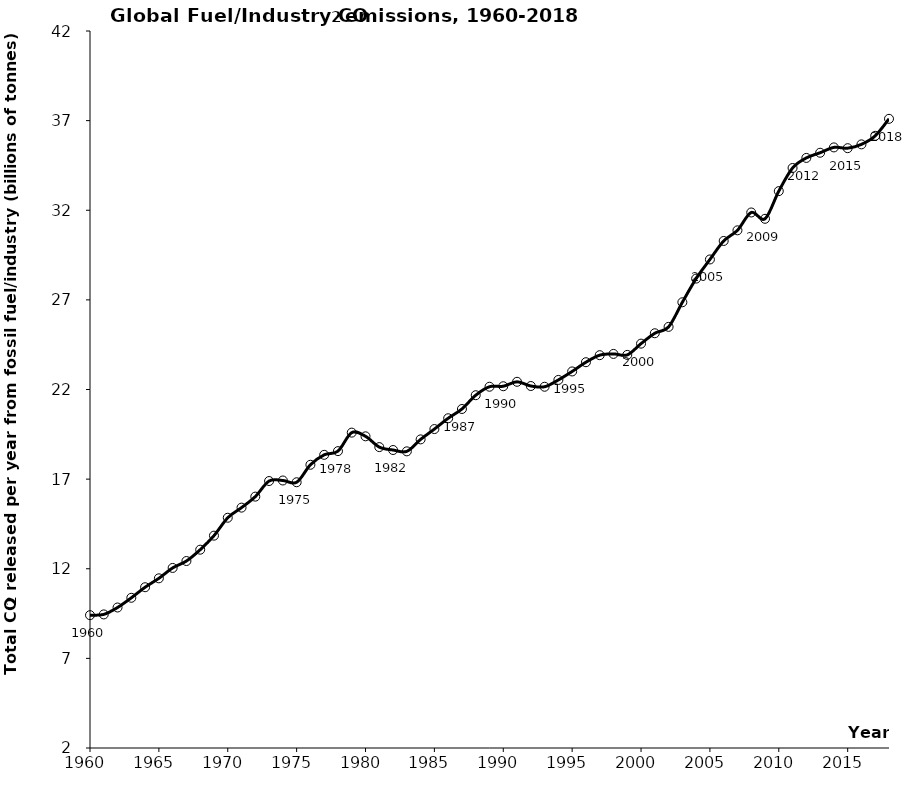
| Category | Series 0 |
|---|---|
| 1960.0 | 9.411 |
| 1961.0 | 9.452 |
| 1962.0 | 9.838 |
| 1963.0 | 10.379 |
| 1964.0 | 10.969 |
| 1965.0 | 11.466 |
| 1966.0 | 12.046 |
| 1967.0 | 12.431 |
| 1968.0 | 13.063 |
| 1969.0 | 13.846 |
| 1970.0 | 14.846 |
| 1971.0 | 15.41 |
| 1972.0 | 16.024 |
| 1973.0 | 16.893 |
| 1974.0 | 16.924 |
| 1975.0 | 16.826 |
| 1976.0 | 17.801 |
| 1977.0 | 18.355 |
| 1978.0 | 18.562 |
| 1979.0 | 19.594 |
| 1980.0 | 19.388 |
| 1981.0 | 18.787 |
| 1982.0 | 18.624 |
| 1983.0 | 18.549 |
| 1984.0 | 19.217 |
| 1985.0 | 19.793 |
| 1986.0 | 20.396 |
| 1987.0 | 20.912 |
| 1988.0 | 21.681 |
| 1989.0 | 22.154 |
| 1990.0 | 22.182 |
| 1991.0 | 22.429 |
| 1992.0 | 22.195 |
| 1993.0 | 22.153 |
| 1994.0 | 22.534 |
| 1995.0 | 23.007 |
| 1996.0 | 23.523 |
| 1997.0 | 23.915 |
| 1998.0 | 23.985 |
| 1999.0 | 23.931 |
| 2000.0 | 24.559 |
| 2001.0 | 25.138 |
| 2002.0 | 25.494 |
| 2003.0 | 26.867 |
| 2004.0 | 28.188 |
| 2005.0 | 29.255 |
| 2006.0 | 30.287 |
| 2007.0 | 30.88 |
| 2008.0 | 31.876 |
| 2009.0 | 31.523 |
| 2010.0 | 33.067 |
| 2011.0 | 34.357 |
| 2012.0 | 34.919 |
| 2013.0 | 35.208 |
| 2014.0 | 35.506 |
| 2015.0 | 35.463 |
| 2016.0 | 35.675 |
| 2017.0 | 36.153 |
| 2018.0 | 37.1 |